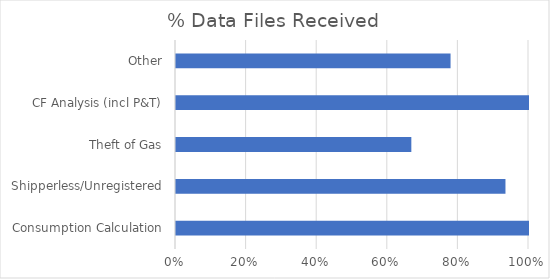
| Category | % Data Received |
|---|---|
| Consumption Calculation | 1 |
| Shipperless/Unregistered | 0.933 |
| Theft of Gas | 0.667 |
| CF Analysis (incl P&T) | 1 |
| Other | 0.778 |